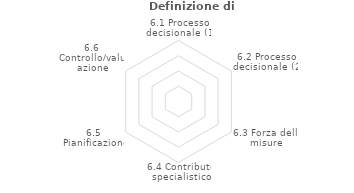
| Category | Series 2 |
|---|---|
| 6.1 Processo decisionale (1) | 0 |
| 6.2 Processo decisionale (2) | 0 |
| 6.3 Forza delle misure | 0 |
| 6.4 Contributo specialistico | 0 |
| 6.5 Pianificazione | 0 |
| 6.6 Controllo/valutazione | 0 |